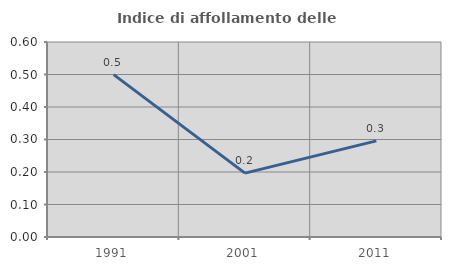
| Category | Indice di affollamento delle abitazioni  |
|---|---|
| 1991.0 | 0.5 |
| 2001.0 | 0.196 |
| 2011.0 | 0.296 |